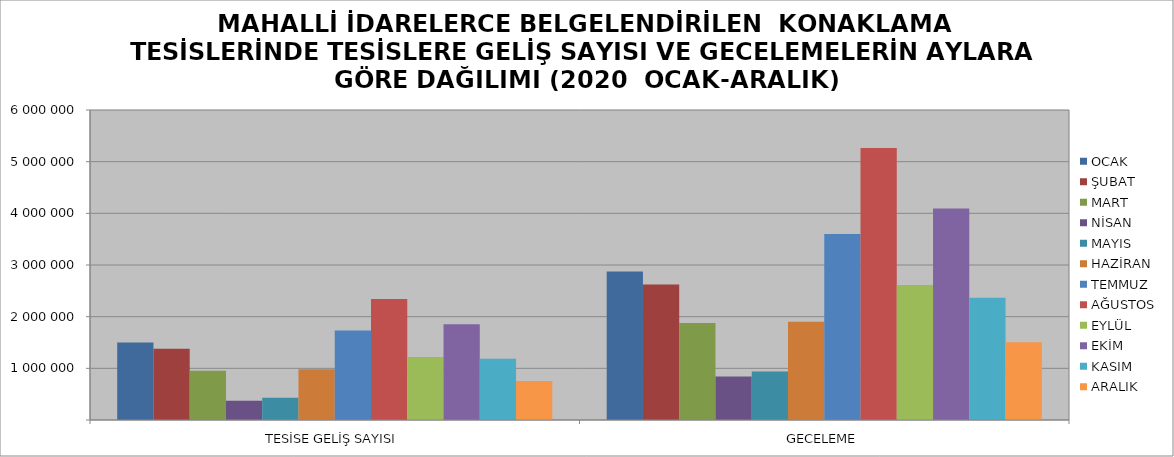
| Category | OCAK | ŞUBAT | MART | NİSAN | MAYIS | HAZİRAN | TEMMUZ | AĞUSTOS | EYLÜL | EKİM | KASIM | ARALIK |
|---|---|---|---|---|---|---|---|---|---|---|---|---|
| TESİSE GELİŞ SAYISI | 1497815 | 1380765 | 955554 | 372466 | 430328 | 981538 | 1730606 | 2342031 | 1217037 | 1851250 | 1184182 | 752452 |
| GECELEME | 2872303 | 2621819 | 1878971 | 839735 | 939652 | 1902057 | 3601580 | 5263679 | 2612279 | 4093869 | 2364780 | 1503185 |